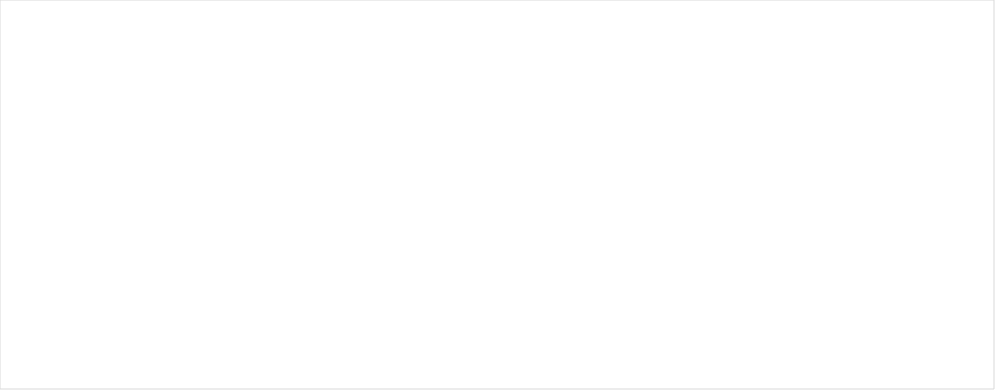
| Category | Summer av Ferdig bilveg | Summer av Ferdig traktorveg |
|---|---|---|
| 2000 | 39123 | 24311 |
| 2001 | 34021 | 20203 |
| 2002 | 57267 | 59477 |
| 2003 | 42714 | 28887 |
| 2004 | 19885 | 18730 |
| 2005 | 18053 | 26087 |
| 2006 | 17403 | 13316 |
| 2007 | 16772 | 20187 |
| 2008 | 13590 | 13050 |
| 2009 | 11710 | 25640 |
| 2010 | 20889 | 10400 |
| 2011 | 27636 | 7650 |
| 2012 | 12120 | 5475 |
| 2013 | 22914 | 5350 |
| 2014 | 20371 | 5850 |
| 2015 | 25101 | 4500 |
| 2016 | 33467 | 9510 |
| 2017 | 46517 | 5919 |
| 2018 | 59969 | 5105 |
| 2019 | 54825 | 0 |
| 2020 | 38741 | 3080 |
| 2021 | 27037 | 1720 |
| 2022 | 33955 | 6367 |